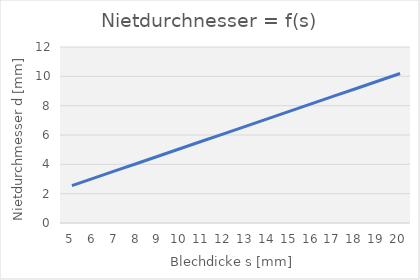
| Category | Series 0 |
|---|---|
| 5.0 | 2.548 |
| 6.0 | 3.057 |
| 7.0 | 3.567 |
| 8.0 | 4.076 |
| 9.0 | 4.586 |
| 10.0 | 5.096 |
| 11.0 | 5.605 |
| 12.0 | 6.115 |
| 13.0 | 6.624 |
| 14.0 | 7.134 |
| 15.0 | 7.643 |
| 16.0 | 8.153 |
| 17.0 | 8.662 |
| 18.0 | 9.172 |
| 19.0 | 9.682 |
| 20.0 | 10.191 |